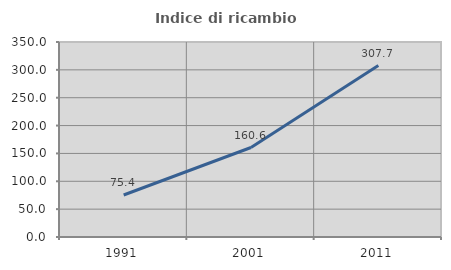
| Category | Indice di ricambio occupazionale  |
|---|---|
| 1991.0 | 75.41 |
| 2001.0 | 160.606 |
| 2011.0 | 307.692 |